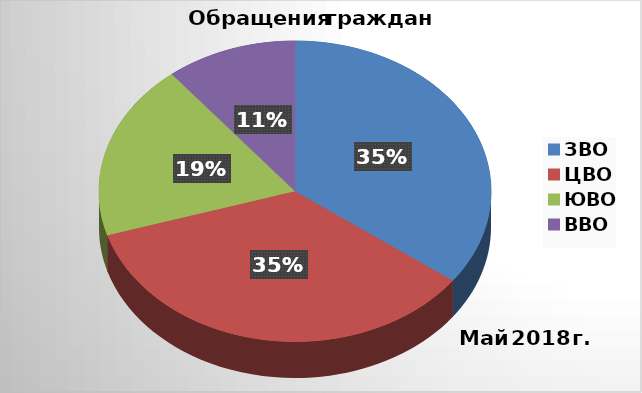
| Category | Series 0 |
|---|---|
| ЗВО | 13 |
| ЦВО | 13 |
| ЮВО | 7 |
| ВВО | 4 |